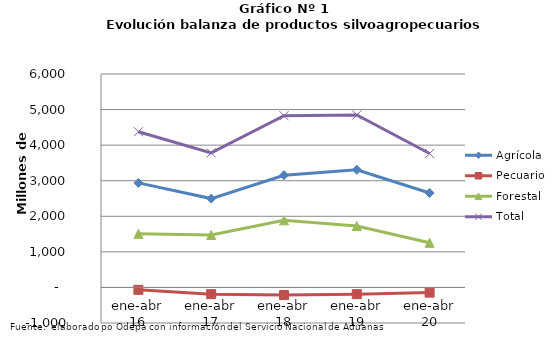
| Category | Agrícola | Pecuario | Forestal | Total |
|---|---|---|---|---|
| ene-abr 16 | 2939216 | -67423 | 1505840 | 4377633 |
| ene-abr 17 | 2497789 | -189455 | 1475069 | 3783403 |
| ene-abr 18 | 3154519 | -215195 | 1887085 | 4826409 |
| ene-abr 19 | 3308592 | -189539 | 1727871 | 4846924 |
| ene-abr 20 | 2656060 | -146016 | 1253864 | 3763908 |